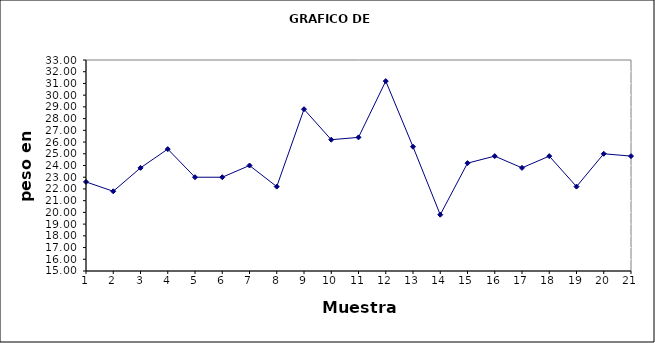
| Category | MEDIA |
|---|---|
| 1.0 | 22.6 |
| 2.0 | 21.8 |
| 3.0 | 23.8 |
| 4.0 | 25.4 |
| 5.0 | 23 |
| 6.0 | 23 |
| 7.0 | 24 |
| 8.0 | 22.2 |
| 9.0 | 28.8 |
| 10.0 | 26.2 |
| 11.0 | 26.4 |
| 12.0 | 31.2 |
| 13.0 | 25.6 |
| 14.0 | 19.8 |
| 15.0 | 24.2 |
| 16.0 | 24.8 |
| 17.0 | 23.8 |
| 18.0 | 24.8 |
| 19.0 | 22.2 |
| 20.0 | 25 |
| 21.0 | 24.8 |